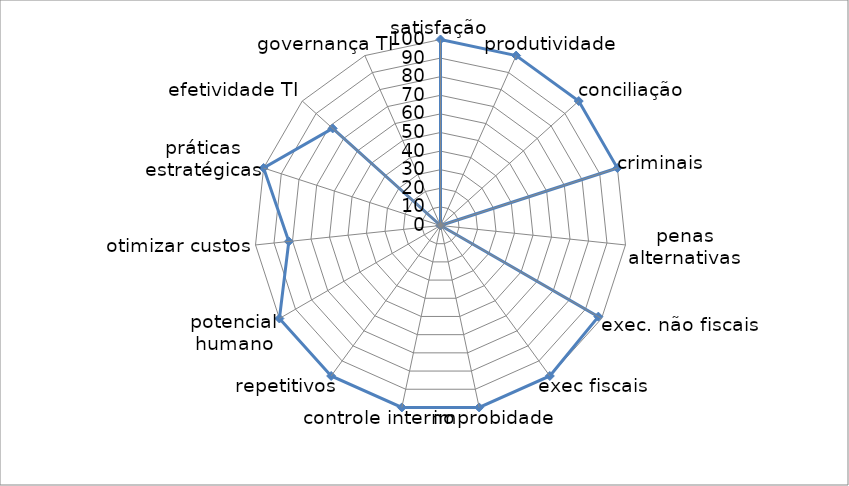
| Category | Series 0 |
|---|---|
| 0 | 100 |
| 1 | 100 |
| 2 | 100 |
| 3 | 100 |
| 4 | 0 |
| 5 | 98 |
| 6 | 100 |
| 7 | 100 |
| 8 | 100 |
| 9 | 100 |
| 10 | 100 |
| 11 | 82 |
| 12 | 100 |
| 13 | 78 |
| 14 | 0 |